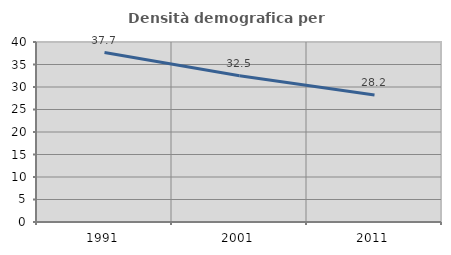
| Category | Densità demografica |
|---|---|
| 1991.0 | 37.658 |
| 2001.0 | 32.486 |
| 2011.0 | 28.221 |